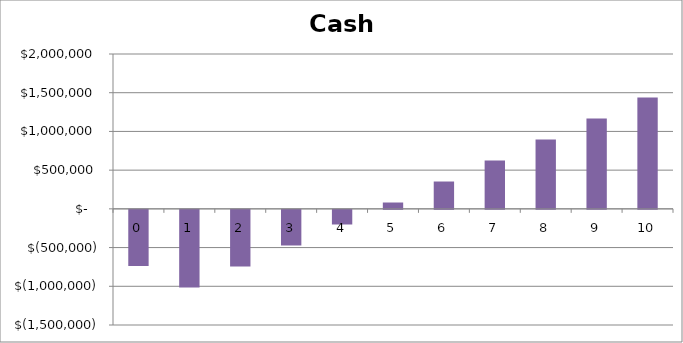
| Category | Cash Balance |
|---|---|
| 0.0 | -723500 |
| 1.0 | -1002392.633 |
| 2.0 | -731285.267 |
| 3.0 | -460177.9 |
| 4.0 | -189070.533 |
| 5.0 | 82036.833 |
| 6.0 | 353144.2 |
| 7.0 | 624251.567 |
| 8.0 | 895358.933 |
| 9.0 | 1166466.3 |
| 10.0 | 1437573.667 |